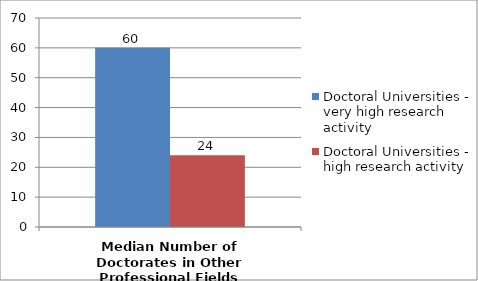
| Category | Doctoral Universities - very high research activity | Doctoral Universities - high research activity |
|---|---|---|
| Median Number of Doctorates in Other Professional Fields | 60 | 24 |